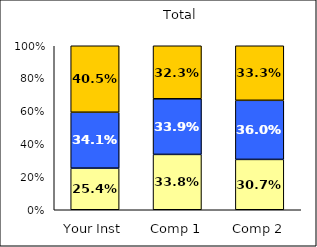
| Category | Low Habits of Mind | Average Habits of Mind | High Habits of Mind |
|---|---|---|---|
| Your Inst | 0.254 | 0.341 | 0.405 |
| Comp 1 | 0.338 | 0.339 | 0.323 |
| Comp 2 | 0.307 | 0.36 | 0.333 |